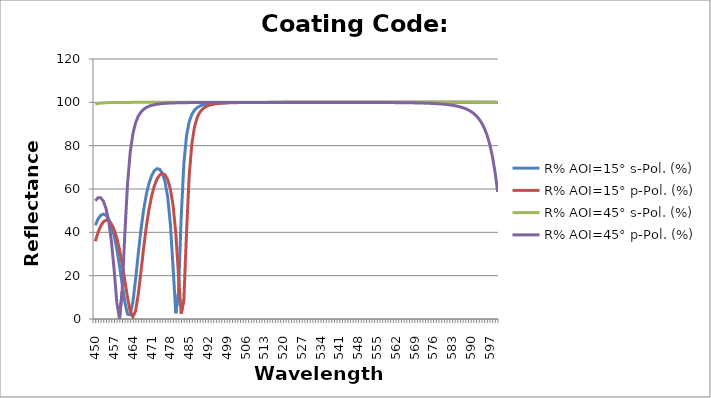
| Category | R% AOI=15° s-Pol. (%) | R% AOI=15° p-Pol. (%) | R% AOI=45° s-Pol. (%) | R% AOI=45° p-Pol. (%) |
|---|---|---|---|---|
| 450.0 | 43.256 | 35.886 | 99.175 | 54.568 |
| 451.0 | 46.131 | 39.961 | 99.455 | 55.953 |
| 452.0 | 47.846 | 42.934 | 99.627 | 55.957 |
| 453.0 | 48.421 | 44.811 | 99.736 | 54.404 |
| 454.0 | 47.835 | 45.601 | 99.809 | 50.93 |
| 455.0 | 46.057 | 45.307 | 99.858 | 45.028 |
| 456.0 | 42.979 | 43.901 | 99.892 | 35.846 |
| 457.0 | 38.451 | 41.3 | 99.917 | 22.75 |
| 458.0 | 32.352 | 37.396 | 99.935 | 7.653 |
| 459.0 | 24.734 | 32.097 | 99.949 | 0.093 |
| 460.0 | 16.103 | 25.428 | 99.959 | 12.919 |
| 461.0 | 7.819 | 17.715 | 99.966 | 39.365 |
| 462.0 | 2.254 | 9.866 | 99.972 | 62.31 |
| 463.0 | 1.962 | 3.578 | 99.977 | 76.94 |
| 464.0 | 7.849 | 1.024 | 99.981 | 85.511 |
| 465.0 | 18.222 | 3.718 | 99.984 | 90.546 |
| 466.0 | 30.109 | 11.314 | 99.986 | 93.597 |
| 467.0 | 41.174 | 21.758 | 99.988 | 95.515 |
| 468.0 | 50.338 | 32.684 | 99.99 | 96.766 |
| 469.0 | 57.417 | 42.51 | 99.991 | 97.607 |
| 470.0 | 62.613 | 50.581 | 99.992 | 98.19 |
| 471.0 | 66.211 | 56.827 | 99.993 | 98.603 |
| 472.0 | 68.434 | 61.421 | 99.994 | 98.904 |
| 473.0 | 69.398 | 64.575 | 99.995 | 99.126 |
| 474.0 | 69.07 | 66.45 | 99.995 | 99.293 |
| 475.0 | 67.215 | 67.106 | 99.996 | 99.422 |
| 476.0 | 63.27 | 66.47 | 99.996 | 99.521 |
| 477.0 | 56.043 | 64.257 | 99.997 | 99.6 |
| 478.0 | 43.471 | 59.88 | 99.997 | 99.662 |
| 479.0 | 23.331 | 52.241 | 99.997 | 99.712 |
| 480.0 | 2.651 | 39.549 | 99.997 | 99.753 |
| 481.0 | 12.167 | 20.46 | 99.998 | 99.786 |
| 482.0 | 46.661 | 2.449 | 99.998 | 99.813 |
| 483.0 | 71.732 | 8.838 | 99.998 | 99.836 |
| 484.0 | 84.627 | 39.882 | 99.998 | 99.854 |
| 485.0 | 91.094 | 66.249 | 99.998 | 99.87 |
| 486.0 | 94.517 | 81.075 | 99.998 | 99.884 |
| 487.0 | 96.446 | 88.851 | 99.998 | 99.896 |
| 488.0 | 97.598 | 93.064 | 99.999 | 99.905 |
| 489.0 | 98.319 | 95.471 | 99.999 | 99.914 |
| 490.0 | 98.789 | 96.921 | 99.999 | 99.921 |
| 491.0 | 99.106 | 97.834 | 99.999 | 99.928 |
| 492.0 | 99.325 | 98.432 | 99.999 | 99.934 |
| 493.0 | 99.482 | 98.837 | 99.999 | 99.939 |
| 494.0 | 99.595 | 99.119 | 99.999 | 99.943 |
| 495.0 | 99.679 | 99.321 | 99.999 | 99.947 |
| 496.0 | 99.742 | 99.467 | 99.999 | 99.95 |
| 497.0 | 99.791 | 99.576 | 99.999 | 99.953 |
| 498.0 | 99.828 | 99.659 | 99.999 | 99.956 |
| 499.0 | 99.857 | 99.722 | 99.999 | 99.958 |
| 500.0 | 99.881 | 99.771 | 99.999 | 99.96 |
| 501.0 | 99.899 | 99.809 | 99.999 | 99.962 |
| 502.0 | 99.914 | 99.84 | 99.999 | 99.964 |
| 503.0 | 99.927 | 99.864 | 99.999 | 99.966 |
| 504.0 | 99.937 | 99.884 | 99.999 | 99.967 |
| 505.0 | 99.945 | 99.9 | 99.999 | 99.968 |
| 506.0 | 99.952 | 99.914 | 99.999 | 99.969 |
| 507.0 | 99.958 | 99.925 | 99.999 | 99.97 |
| 508.0 | 99.963 | 99.934 | 99.999 | 99.971 |
| 509.0 | 99.967 | 99.942 | 99.999 | 99.972 |
| 510.0 | 99.97 | 99.949 | 99.999 | 99.972 |
| 511.0 | 99.973 | 99.954 | 99.999 | 99.973 |
| 512.0 | 99.976 | 99.959 | 99.999 | 99.973 |
| 513.0 | 99.978 | 99.963 | 99.999 | 99.974 |
| 514.0 | 99.98 | 99.967 | 99.999 | 99.974 |
| 515.0 | 99.982 | 99.97 | 99.999 | 99.974 |
| 516.0 | 99.984 | 99.972 | 99.999 | 99.975 |
| 517.0 | 99.985 | 99.975 | 99.999 | 99.975 |
| 518.0 | 99.986 | 99.977 | 99.999 | 99.975 |
| 519.0 | 99.987 | 99.979 | 99.999 | 99.975 |
| 520.0 | 99.988 | 99.98 | 99.999 | 99.975 |
| 521.0 | 99.989 | 99.982 | 99.999 | 99.975 |
| 522.0 | 99.99 | 99.983 | 99.999 | 99.975 |
| 523.0 | 99.99 | 99.984 | 99.999 | 99.975 |
| 524.0 | 99.991 | 99.985 | 99.999 | 99.975 |
| 525.0 | 99.991 | 99.986 | 99.999 | 99.974 |
| 526.0 | 99.992 | 99.987 | 99.999 | 99.974 |
| 527.0 | 99.992 | 99.988 | 99.999 | 99.974 |
| 528.0 | 99.993 | 99.988 | 99.999 | 99.973 |
| 529.0 | 99.993 | 99.989 | 99.999 | 99.973 |
| 530.0 | 99.993 | 99.989 | 99.999 | 99.972 |
| 531.0 | 99.994 | 99.99 | 99.999 | 99.972 |
| 532.0 | 99.994 | 99.99 | 99.999 | 99.971 |
| 533.0 | 99.994 | 99.991 | 99.999 | 99.97 |
| 534.0 | 99.994 | 99.991 | 99.999 | 99.97 |
| 535.0 | 99.995 | 99.992 | 99.999 | 99.969 |
| 536.0 | 99.995 | 99.992 | 99.999 | 99.968 |
| 537.0 | 99.995 | 99.992 | 99.999 | 99.966 |
| 538.0 | 99.995 | 99.992 | 99.999 | 99.965 |
| 539.0 | 99.995 | 99.992 | 99.999 | 99.964 |
| 540.0 | 99.995 | 99.993 | 99.999 | 99.963 |
| 541.0 | 99.995 | 99.993 | 99.999 | 99.961 |
| 542.0 | 99.996 | 99.993 | 99.999 | 99.959 |
| 543.0 | 99.996 | 99.993 | 99.999 | 99.958 |
| 544.0 | 99.996 | 99.993 | 99.999 | 99.956 |
| 545.0 | 99.996 | 99.993 | 99.999 | 99.953 |
| 546.0 | 99.996 | 99.994 | 99.999 | 99.951 |
| 547.0 | 99.996 | 99.994 | 99.999 | 99.948 |
| 548.0 | 99.996 | 99.994 | 99.999 | 99.945 |
| 549.0 | 99.996 | 99.994 | 99.999 | 99.942 |
| 550.0 | 99.996 | 99.994 | 99.999 | 99.938 |
| 551.0 | 99.996 | 99.994 | 99.999 | 99.935 |
| 552.0 | 99.996 | 99.994 | 99.999 | 99.93 |
| 553.0 | 99.996 | 99.994 | 99.999 | 99.926 |
| 554.0 | 99.996 | 99.994 | 99.999 | 99.921 |
| 555.0 | 99.996 | 99.994 | 99.998 | 99.916 |
| 556.0 | 99.996 | 99.994 | 99.998 | 99.91 |
| 557.0 | 99.996 | 99.994 | 99.998 | 99.904 |
| 558.0 | 99.996 | 99.994 | 99.998 | 99.897 |
| 559.0 | 99.996 | 99.994 | 99.998 | 99.889 |
| 560.0 | 99.996 | 99.994 | 99.998 | 99.881 |
| 561.0 | 99.996 | 99.994 | 99.998 | 99.871 |
| 562.0 | 99.996 | 99.994 | 99.998 | 99.861 |
| 563.0 | 99.996 | 99.994 | 99.998 | 99.849 |
| 564.0 | 99.996 | 99.994 | 99.998 | 99.836 |
| 565.0 | 99.996 | 99.994 | 99.998 | 99.822 |
| 566.0 | 99.996 | 99.994 | 99.997 | 99.806 |
| 567.0 | 99.996 | 99.993 | 99.997 | 99.788 |
| 568.0 | 99.996 | 99.993 | 99.997 | 99.767 |
| 569.0 | 99.996 | 99.993 | 99.997 | 99.744 |
| 570.0 | 99.996 | 99.993 | 99.997 | 99.718 |
| 571.0 | 99.996 | 99.993 | 99.997 | 99.688 |
| 572.0 | 99.995 | 99.993 | 99.996 | 99.655 |
| 573.0 | 99.995 | 99.993 | 99.996 | 99.616 |
| 574.0 | 99.995 | 99.992 | 99.996 | 99.572 |
| 575.0 | 99.995 | 99.992 | 99.996 | 99.522 |
| 576.0 | 99.995 | 99.992 | 99.995 | 99.464 |
| 577.0 | 99.995 | 99.992 | 99.995 | 99.396 |
| 578.0 | 99.995 | 99.992 | 99.994 | 99.318 |
| 579.0 | 99.994 | 99.991 | 99.994 | 99.227 |
| 580.0 | 99.994 | 99.991 | 99.994 | 99.121 |
| 581.0 | 99.994 | 99.991 | 99.993 | 98.995 |
| 582.0 | 99.994 | 99.991 | 99.992 | 98.847 |
| 583.0 | 99.994 | 99.99 | 99.992 | 98.671 |
| 584.0 | 99.994 | 99.99 | 99.991 | 98.461 |
| 585.0 | 99.993 | 99.99 | 99.99 | 98.208 |
| 586.0 | 99.993 | 99.989 | 99.99 | 97.903 |
| 587.0 | 99.993 | 99.989 | 99.989 | 97.531 |
| 588.0 | 99.992 | 99.988 | 99.988 | 97.075 |
| 589.0 | 99.992 | 99.988 | 99.986 | 96.512 |
| 590.0 | 99.992 | 99.987 | 99.985 | 95.812 |
| 591.0 | 99.992 | 99.987 | 99.984 | 94.932 |
| 592.0 | 99.991 | 99.986 | 99.982 | 93.817 |
| 593.0 | 99.991 | 99.985 | 99.98 | 92.391 |
| 594.0 | 99.99 | 99.984 | 99.978 | 90.551 |
| 595.0 | 99.99 | 99.984 | 99.976 | 88.154 |
| 596.0 | 99.989 | 99.983 | 99.973 | 85.006 |
| 597.0 | 99.989 | 99.982 | 99.97 | 80.846 |
| 598.0 | 99.988 | 99.981 | 99.966 | 75.337 |
| 599.0 | 99.988 | 99.98 | 99.962 | 68.081 |
| 600.0 | 99.987 | 99.979 | 99.958 | 58.694 |